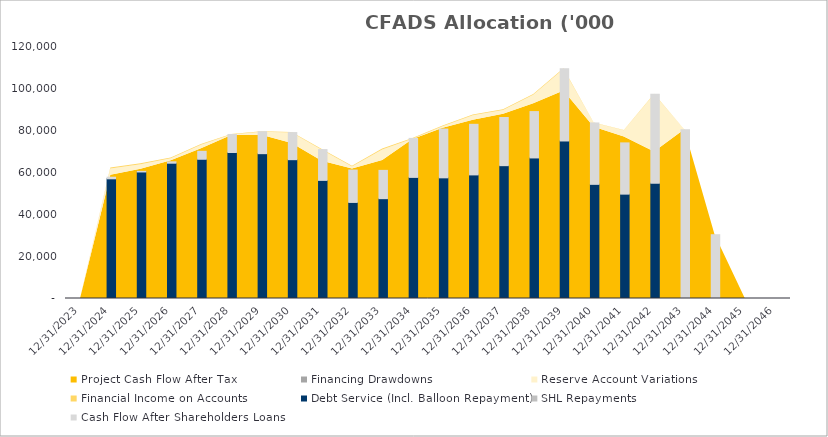
| Category | Debt Service (Incl. Balloon Repayment) | SHL Repayments | Cash Flow After Shareholders Loans |
|---|---|---|---|
| 0 | 0 | 0 | 0 |
| 1/1/00 | 56990.255 | 0 | 770.857 |
| 1/2/00 | 60254.213 | 0 | 285.335 |
| 1/3/00 | 64424.403 | 0 | 663.314 |
| 1/4/00 | 66299.778 | 0 | 3781.115 |
| 1/5/00 | 69522.618 | 0 | 8596.237 |
| 1/6/00 | 68967.426 | 0 | 10479.97 |
| 1/7/00 | 66102.776 | 0 | 12910.312 |
| 1/8/00 | 56242.347 | 0 | 14668.485 |
| 1/9/00 | 45744.915 | 0 | 15428.691 |
| 1/10/00 | 47540.118 | 0 | 13475.5 |
| 1/11/00 | 57668.034 | 0 | 18567.293 |
| 1/12/00 | 57457.793 | 0 | 23235.548 |
| 1/13/00 | 58853.498 | 0 | 24094.363 |
| 1/14/00 | 63254.477 | 0 | 22939.114 |
| 1/15/00 | 66930.543 | 0 | 22077.645 |
| 1/16/00 | 75009.903 | 0 | 34410.718 |
| 1/17/00 | 54355.264 | 0 | 29248.121 |
| 1/18/00 | 49695.753 | 0 | 24405.47 |
| 1/19/00 | 54923.933 | 0 | 42311.018 |
| 1/20/00 | 0 | 0 | 80361.97 |
| 1/21/00 | 0 | 0 | 30379.838 |
| 1/22/00 | 0 | 0 | 0 |
| 1/23/00 | 0 | 0 | 0 |
| 1/24/00 | 0 | 0 | 0 |
| 1/25/00 | 0 | 0 | 0 |
| 1/26/00 | 0 | 0 | 0 |
| 1/27/00 | 0 | 0 | 0 |
| 1/28/00 | 0 | 0 | 0 |